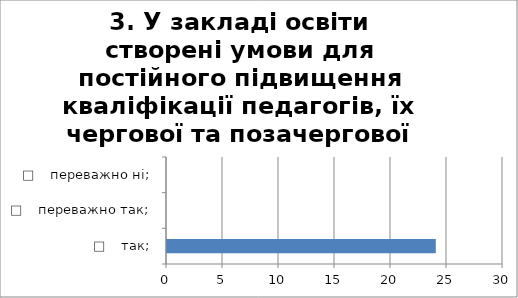
| Category | 3. У закладі освіти створені умови для постійного підвищення кваліфікації педагогів, їх чергової та позачергової атестації, добровільної сертифікації тощо? |
|---|---|
| □    так; | 24 |
| □    переважно так; | 0 |
| □    переважно ні; | 0 |